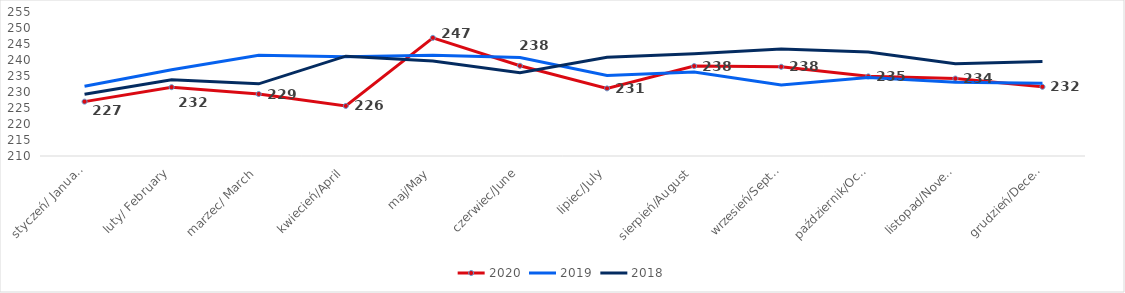
| Category | 2020 | 2019 | 2018 |
|---|---|---|---|
| styczeń/ January | 226.989 | 231.781 | 229.328 |
| luty/ February | 231.505 | 236.982 | 233.829 |
| marzec/ March | 229.369 | 241.462 | 232.544 |
| kwiecień/April | 225.641 | 241.025 | 241.196 |
| maj/May | 246.921 | 241.523 | 239.666 |
| czerwiec/June | 238.194 | 240.788 | 236.045 |
| lipiec/July | 231.134 | 235.139 | 240.878 |
| sierpień/August | 238.095 | 236.277 | 241.928 |
| wrzesień/September | 237.881 | 232.215 | 243.404 |
| październik/October | 234.889 | 234.539 | 242.474 |
| listopad/November | 234.198 | 233.035 | 238.812 |
| grudzień/December | 231.624 | 232.743 | 239.499 |